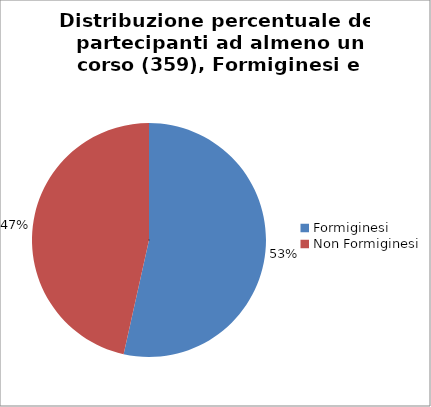
| Category | Nr. Tesserati |
|---|---|
| Formiginesi | 192 |
| Non Formiginesi | 167 |